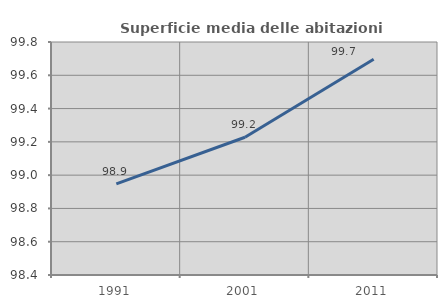
| Category | Superficie media delle abitazioni occupate |
|---|---|
| 1991.0 | 98.947 |
| 2001.0 | 99.228 |
| 2011.0 | 99.697 |